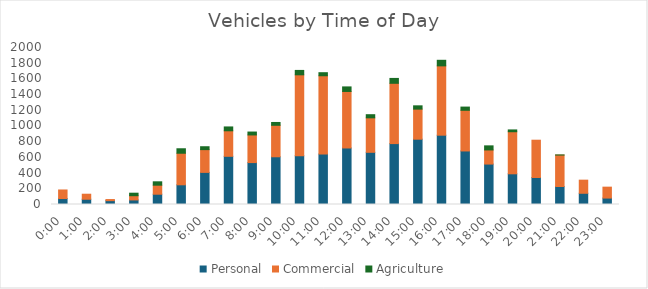
| Category | Personal | Commercial | Agriculture |
|---|---|---|---|
| 0.0 | 76 | 109 | 0 |
| 0.041666666666666664 | 67 | 64 | 0 |
| 0.08333333333333333 | 49 | 14 | 0 |
| 0.125 | 58 | 54 | 32 |
| 0.16666666666666666 | 131 | 115 | 43 |
| 0.20833333333333334 | 251 | 402 | 57 |
| 0.25 | 409 | 290 | 37 |
| 0.2916666666666667 | 614 | 325 | 49 |
| 0.3333333333333333 | 534 | 352 | 37 |
| 0.375 | 608 | 401 | 36 |
| 0.4166666666666667 | 621 | 1031 | 56 |
| 0.4583333333333333 | 643 | 997 | 39 |
| 0.5 | 720 | 720 | 58 |
| 0.5416666666666666 | 665 | 439 | 40 |
| 0.5833333333333334 | 776 | 768 | 62 |
| 0.625 | 832 | 383 | 42 |
| 0.6666666666666666 | 883 | 883 | 71 |
| 0.7083333333333334 | 682 | 518 | 41 |
| 0.75 | 515 | 180 | 52 |
| 0.7916666666666666 | 391 | 536 | 23 |
| 0.8333333333333334 | 344 | 475 | 0 |
| 0.875 | 229 | 401 | 1 |
| 0.9166666666666666 | 143 | 167 | 0 |
| 0.9583333333333334 | 82 | 139 | 0 |